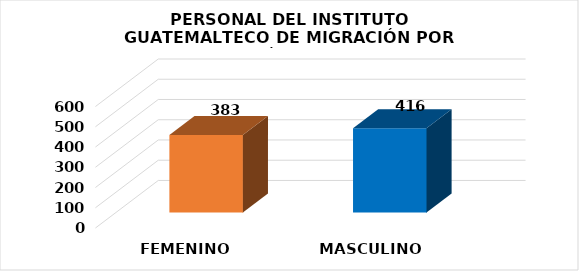
| Category | Series 0 |
|---|---|
| FEMENINO | 383 |
| MASCULINO | 416 |